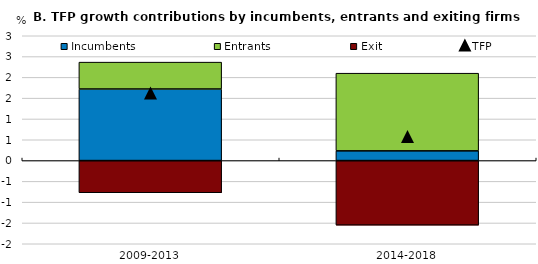
| Category | Incumbents | Entrants | Exit |
|---|---|---|---|
| 2009-2013 | 1.72 | 0.646 | -0.774 |
| 2014-2018 | 0.233 | 1.867 | -1.552 |